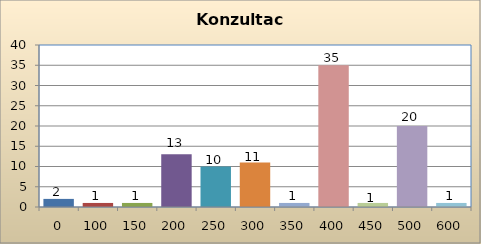
| Category | Series 0 |
|---|---|
| 0.0 | 2 |
| 100.0 | 1 |
| 150.0 | 1 |
| 200.0 | 13 |
| 250.0 | 10 |
| 300.0 | 11 |
| 350.0 | 1 |
| 400.0 | 35 |
| 450.0 | 1 |
| 500.0 | 20 |
| 600.0 | 1 |